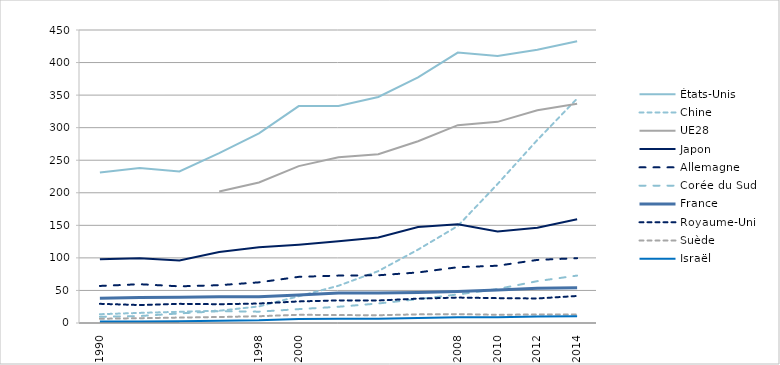
| Category | États-Unis | Chine | UE28 | Japon | Allemagne | Corée du Sud | France | Royaume-Uni | Suède | Israël |
|---|---|---|---|---|---|---|---|---|---|---|
| 1990 | 231004.871 | 13500.443 | 0 | 97812.63 | 56906.008 | 9587.843 | 38063.131 | 29445.037 | 6499.932 | 2133.646 |
|  | 237867.386 | 15496.673 | 0 | 99368.647 | 59572.602 | 10676.227 | 39213.479 | 27586.554 | 7388.117 | 2358.479 |
|  | 232680.483 | 17250.014 | 0 | 95977.762 | 56303.588 | 14716.026 | 39618.885 | 29398.497 | 8358.339 | 2812.227 |
|  | 261029.428 | 18817.758 | 201822.668 | 108986.459 | 58068.758 | 18186.989 | 40187.675 | 28844.423 | 9248.945 | 3391.235 |
| 1998 | 291287.673 | 25467.71 | 215847.215 | 116167.226 | 62434.085 | 17409.653 | 40146.15 | 29906.187 | 10386.872 | 4141.304 |
| 2000 | 333146.143 | 41090.545 | 240902.673 | 120214.619 | 70876.034 | 21290.694 | 43119.418 | 33144.496 | 12638.363 | 6298.847 |
|  | 333151.403 | 57219.386 | 254675.806 | 125583.371 | 72793.944 | 24934.405 | 46197.297 | 34723.156 | 12197.647 | 6630.79 |
|  | 347142.184 | 79685.182 | 259291.819 | 131452.067 | 73285.146 | 29986.094 | 46119.324 | 34590.281 | 11939.434 | 6613.96 |
|  | 377206.793 | 112713.881 | 279227.867 | 147343.114 | 77648.288 | 36634.771 | 47029.048 | 37398.194 | 13264.424 | 7781.917 |
| 2008 | 415342.27 | 149034.406 | 303841.492 | 151538.111 | 85703.607 | 43838.562 | 48523.943 | 39061.363 | 13619.893 | 8926.386 |
| 2010 | 410093 | 213460.101 | 308914.697 | 140607.388 | 87966.066 | 52172.779 | 50764.992 | 38165.606 | 12594.07 | 8658.738 |
| 2012 | 419528.798 | 281108.112 | 326739.682 | 146331.581 | 96885.773 | 64267.687 | 53203.414 | 37682.608 | 13154.105 | 9829.134 |
| 2014 | 432583.172 | 344644.969 | 336705.304 | 159218.277 | 99585.469 | 72833.858 | 54296.797 | 41503.282 | 13119.118 | 10357.52 |